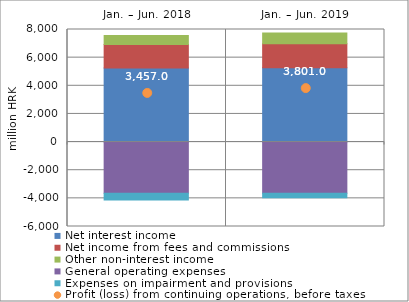
| Category | Net interest income | Net income from fees and commissions | Other non-interest income | General operating expenses | Expenses on impairment and provisions |
|---|---|---|---|---|---|
| Jan. – Jun. 2018 | 5258.432 | 1670.119 | 648 | -3634.396 | -485.142 |
| Jan. – Jun. 2019 | 5286.047 | 1706.245 | 761.875 | -3643.525 | -309.648 |